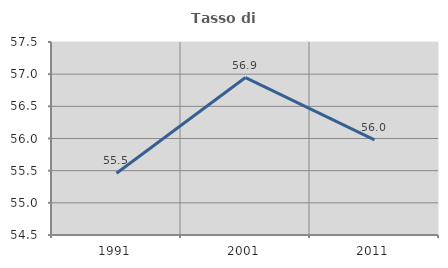
| Category | Tasso di occupazione   |
|---|---|
| 1991.0 | 55.46 |
| 2001.0 | 56.947 |
| 2011.0 | 55.977 |